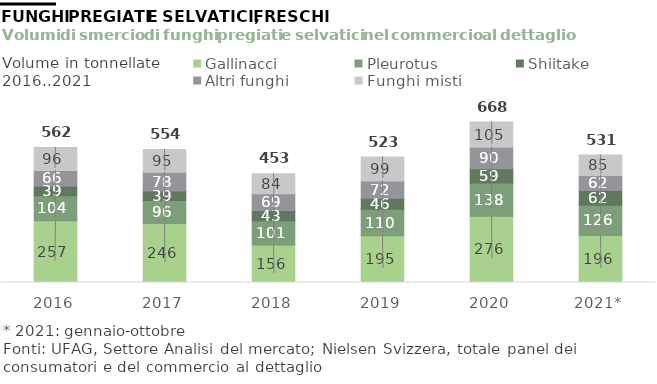
| Category | Gallinacci | Pleurotus | Shiitake | Altri funghi | Funghi misti |
|---|---|---|---|---|---|
| 2016 | 257.369 | 104.295 | 39.198 | 65.661 | 95.661 |
| 2017 | 245.93 | 96.161 | 39.475 | 77.731 | 94.701 |
| 2018 | 156.232 | 100.629 | 43.206 | 69.285 | 83.64 |
| 2019 | 194.794 | 110.383 | 45.873 | 72.346 | 99.123 |
| 2020 | 276.199 | 138.348 | 59.027 | 90.359 | 104.554 |
| 2021* | 195.929 | 126.04 | 61.774 | 62.067 | 85.351 |